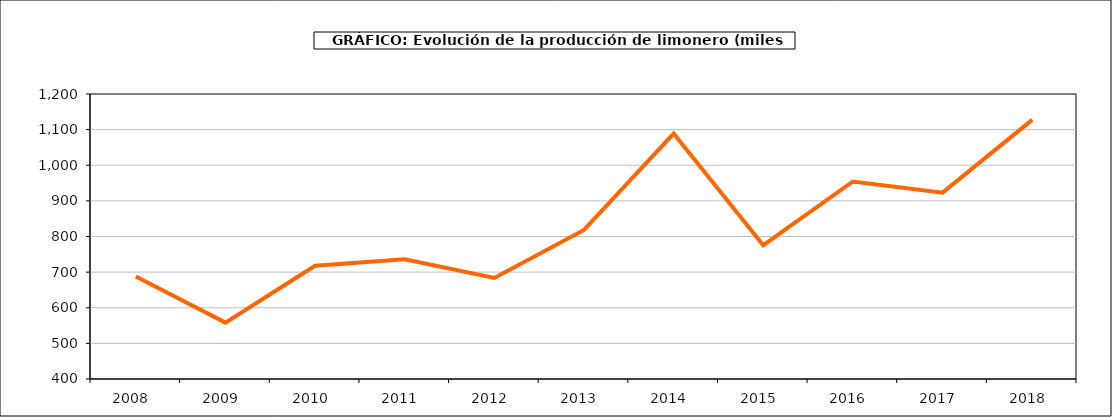
| Category | producción |
|---|---|
| 2008.0 | 687.936 |
| 2009.0 | 558.18 |
| 2010.0 | 717.906 |
| 2011.0 | 736.198 |
| 2012.0 | 683.604 |
| 2013.0 | 818.489 |
| 2014.0 | 1088.964 |
| 2015.0 | 775.546 |
| 2016.0 | 954.479 |
| 2017.0 | 923.192 |
| 2018.0 | 1127.509 |